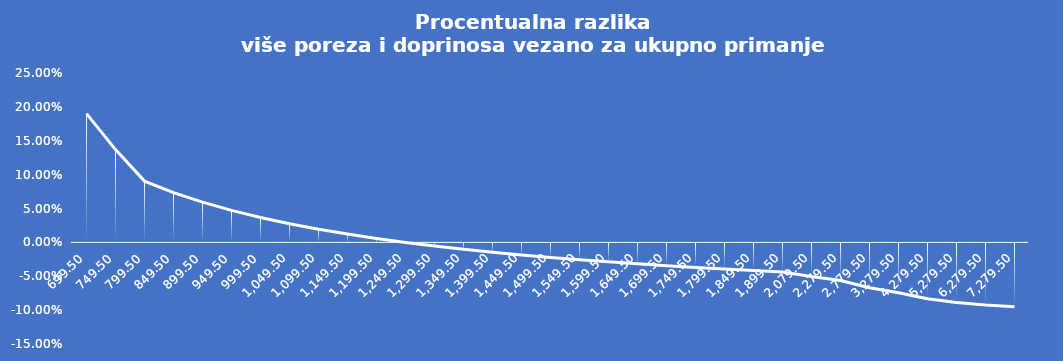
| Category | Procentualna razlika |
|---|---|
| 699.5 | 0.19 |
| 749.5 | 0.137 |
| 799.5 | 0.09 |
| 849.5 | 0.074 |
| 899.5 | 0.059 |
| 949.5 | 0.047 |
| 999.5 | 0.037 |
| 1049.5 | 0.028 |
| 1099.5 | 0.019 |
| 1149.5 | 0.012 |
| 1199.5 | 0.006 |
| 1249.5 | 0 |
| 1299.5 | -0.005 |
| 1349.5 | -0.01 |
| 1399.5 | -0.014 |
| 1449.5 | -0.018 |
| 1499.5 | -0.022 |
| 1549.5 | -0.026 |
| 1599.5 | -0.029 |
| 1649.5 | -0.032 |
| 1699.5 | -0.034 |
| 1749.5 | -0.037 |
| 1799.5 | -0.039 |
| 1849.5 | -0.042 |
| 1899.5 | -0.044 |
| 2079.5 | -0.05 |
| 2279.5 | -0.056 |
| 2779.5 | -0.067 |
| 3279.5 | -0.074 |
| 4279.5 | -0.083 |
| 5279.5 | -0.089 |
| 6279.5 | -0.092 |
| 7279.5 | -0.095 |